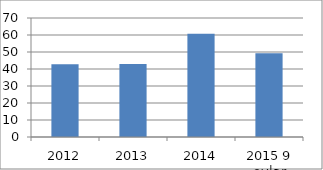
| Category | Series 0 |
|---|---|
| 2012 | 42.8 |
| 2013 | 42.9 |
| 2014 | 60.7 |
| 2015 9 oylar | 49.2 |